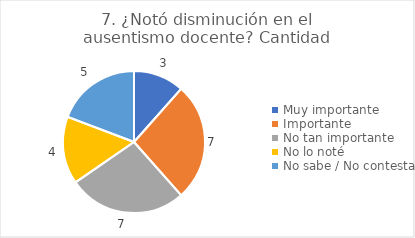
| Category | 7. ¿Notó disminución en el ausentismo docente? |
|---|---|
| Muy importante  | 0.115 |
| Importante  | 0.269 |
| No tan importante  | 0.269 |
| No lo noté  | 0.154 |
| No sabe / No contesta | 0.192 |